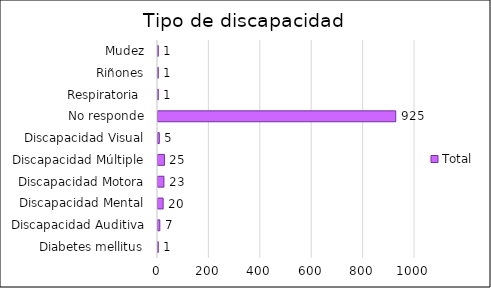
| Category | Total |
|---|---|
| Diabetes mellitus | 1 |
| Discapacidad Auditiva | 7 |
| Discapacidad Mental | 20 |
| Discapacidad Motora | 23 |
| Discapacidad Múltiple | 25 |
| Discapacidad Visual | 5 |
| No responde | 925 |
| Respiratoria  | 1 |
| Riñones | 1 |
| Mudez | 1 |